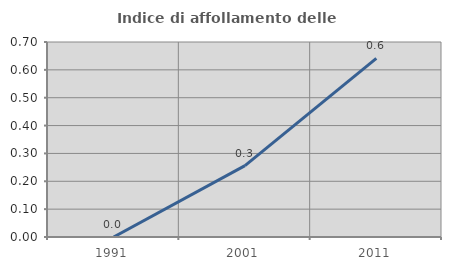
| Category | Indice di affollamento delle abitazioni  |
|---|---|
| 1991.0 | 0 |
| 2001.0 | 0.256 |
| 2011.0 | 0.641 |